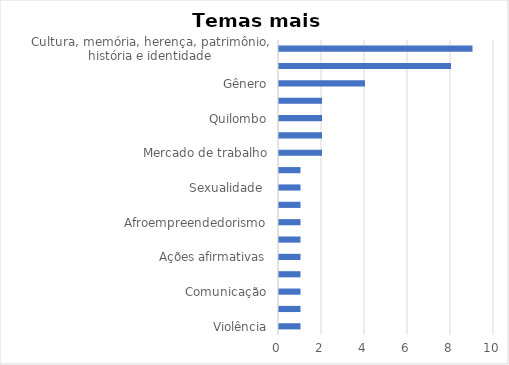
| Category | Series 0 |
|---|---|
| Violência | 1 |
| Movimentos sociais | 1 |
| Comunicação | 1 |
| Turismo sexual | 1 |
| Ações afirmativas | 1 |
| Interseccionalidade  | 1 |
| Afroempreendedorismo | 1 |
| Estado da arte | 1 |
| Sexualidade  | 1 |
| TBC | 1 |
| Mercado de trabalho | 2 |
| Educação | 2 |
| Quilombo | 2 |
| Racismo | 2 |
| Gênero | 4 |
| Turismo étnico, turismo de raizes, turismo de raízes africanas, turismo diapóstico, turismo etnico afro | 8 |
| Cultura, memória, herença, patrimônio, história e identidade | 9 |